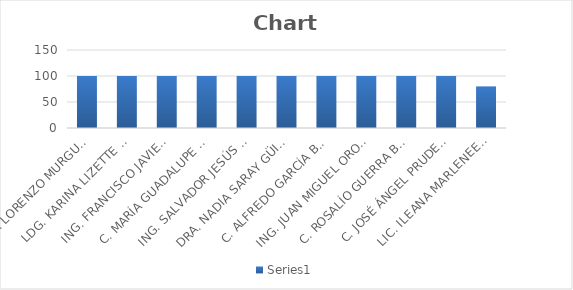
| Category | Series 0 |
|---|---|
| LAE. LORENZO MURGUÍA LÓPEZ | 100 |
| LDG. KARINA LIZETTE MORALES PÉREZ | 100 |
| ING. FRANCISCO JAVIER AGUILAR MACIAS | 100 |
| C. MARÍA GUADALUPE CHÁVEZ MURGUÍA | 100 |
| ING. SALVADOR JESÚS PÉREZ TOPETE | 100 |
| DRA. NADIA SARAY GÜITRÓN GÓMEZ | 100 |
| C. ALFREDO GARCÍA BARBA | 100 |
| ING. JUAN MIGUEL OROZCO ZAVALZA | 100 |
| C. ROSALÍO GUERRA BELTRAN | 100 |
| C. JOSÉ ÁNGEL PRUDENCIO VARGAS | 100 |
| LIC. ILEANA MARLENEE ZABALZA PELAYO  | 80 |